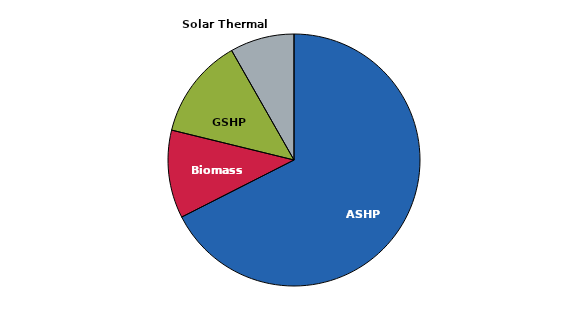
| Category | Series 0 |
|---|---|
| ASHP | 0.675 |
| Biomass | 0.113 |
| GSHP | 0.129 |
| Solar Thermal | 0.082 |